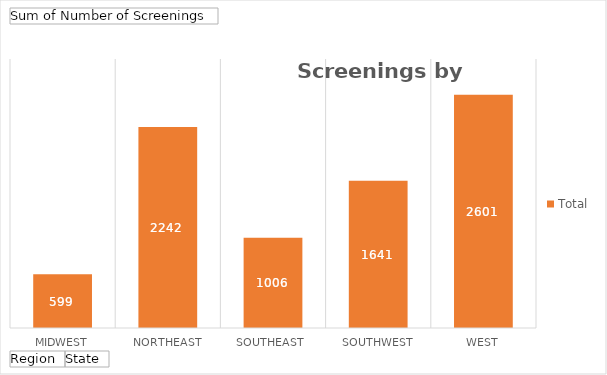
| Category | Total |
|---|---|
| Midwest | 599 |
| Northeast | 2242 |
| Southeast  | 1006 |
| Southwest | 1641 |
| West | 2601 |